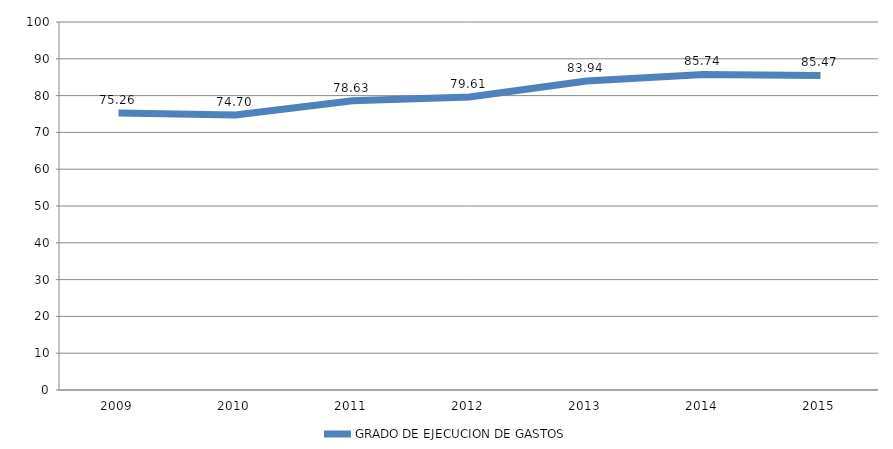
| Category | GRADO DE EJECUCION DE GASTOS |
|---|---|
| 2009.0 | 75.261 |
| 2010.0 | 74.702 |
| 2011.0 | 78.626 |
| 2012.0 | 79.605 |
| 2013.0 | 83.941 |
| 2014.0 | 85.741 |
| 2015.0 | 85.47 |